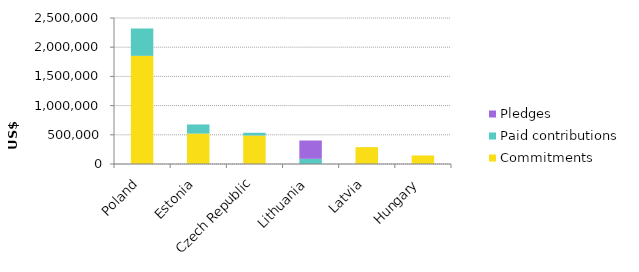
| Category | Commitments | Paid contributions | Pledges |
|---|---|---|---|
| Poland | 1852264 | 468056 | 0 |
| Estonia | 520086 | 157067 | 0 |
| Czech Republic | 487264 | 47393 | 0 |
| Lithuania | 0 | 88904 | 313369 |
| Latvia | 288389 | 0 | 0 |
| Hungary | 145759 | 0 | 0 |